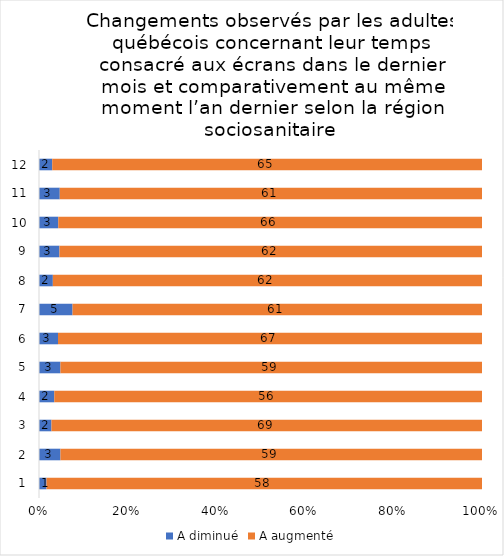
| Category | A diminué | A augmenté |
|---|---|---|
| 0 | 1 | 58 |
| 1 | 3 | 59 |
| 2 | 2 | 69 |
| 3 | 2 | 56 |
| 4 | 3 | 59 |
| 5 | 3 | 67 |
| 6 | 5 | 61 |
| 7 | 2 | 62 |
| 8 | 3 | 62 |
| 9 | 3 | 66 |
| 10 | 3 | 61 |
| 11 | 2 | 65 |